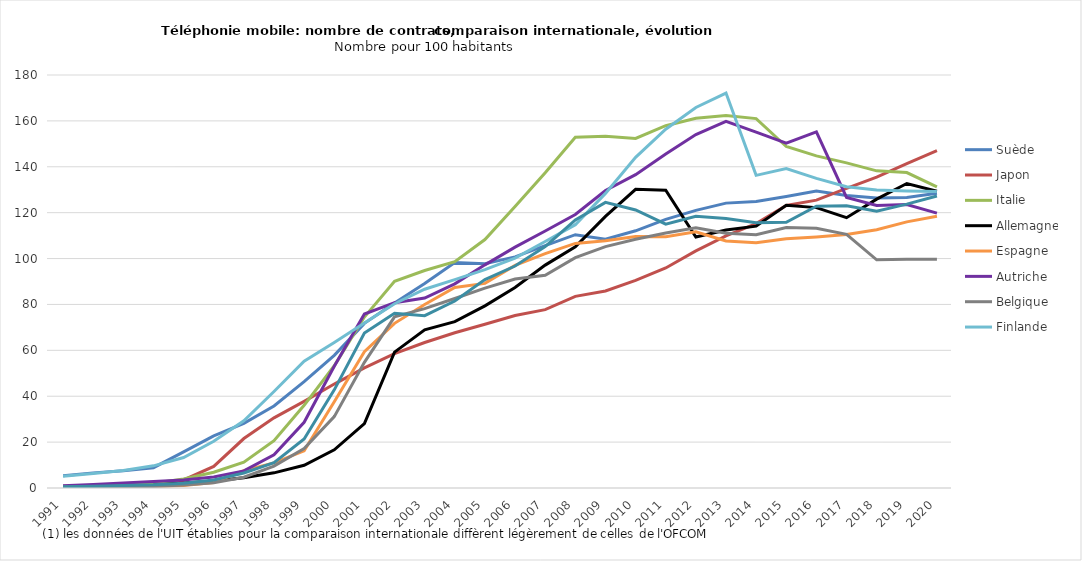
| Category | Suède | Japon | Italie | Allemagne | Espagne | Autriche | Belgique | Finlande | Pays-Bas |
|---|---|---|---|---|---|---|---|---|---|
| 1991 | 5.388 | 0.71 | 0.468 | 0 | 0.141 | 0.961 | 0.43 | 5.171 | 0.531 |
| 1992 | 6.594 | 1.123 | 0.999 | 0.339 | 0.278 | 1.494 | 0.514 | 6.371 | 0.767 |
| 1993 | 7.56 | 1.39 | 1.376 | 0.657 | 0.461 | 2.212 | 0.612 | 7.667 | 1.099 |
| 1994 | 8.864 | 1.724 | 2.12 | 1.191 | 0.656 | 2.805 | 0.672 | 9.665 | 1.42 |
| 1995 | 15.713 | 3.49 | 3.932 | 2.158 | 1.048 | 3.505 | 1.264 | 13.282 | 2.096 |
| 1996 | 22.749 | 9.409 | 6.886 | 3.01 | 2.397 | 4.803 | 2.315 | 20.342 | 3.495 |
| 1997 | 28.16 | 21.561 | 11.279 | 4.48 | 7.586 | 7.475 | 4.694 | 29.302 | 6.549 |
| 1998 | 35.771 | 30.591 | 20.634 | 6.61 | 10.953 | 14.471 | 9.548 | 42.067 | 11.004 |
| 1999 | 46.371 | 37.765 | 36.04 | 9.912 | 16.203 | 28.629 | 17.18 | 55.227 | 21.36 |
| 2000 | 57.832 | 45.302 | 53.27 | 16.662 | 37.561 | 53.078 | 31.112 | 63.38 | 42.767 |
| 2001 | 71.747 | 52.37 | 74.518 | 28.082 | 59.437 | 75.806 | 54.746 | 71.871 | 67.53 |
| 2002 | 80.672 | 58.583 | 90.103 | 59.216 | 71.772 | 80.776 | 74.59 | 80.292 | 76.164 |
| 2003 | 89.107 | 63.427 | 94.784 | 68.905 | 79.989 | 82.809 | 78.166 | 86.638 | 75.107 |
| 2004 | 98.319 | 67.668 | 98.62 | 72.518 | 87.378 | 88.969 | 82.597 | 90.818 | 81.477 |
| 2005 | 97.713 | 71.35 | 108.286 | 79.398 | 89.18 | 97.264 | 87.134 | 95.151 | 90.869 |
| 2006 | 100.723 | 75.187 | 122.681 | 87.355 | 96.99 | 104.984 | 91.067 | 100.211 | 96.743 |
| 2007 | 105.616 | 77.732 | 137.367 | 97.143 | 102.161 | 112.017 | 92.729 | 107.437 | 105.206 |
| 2008 | 110.411 | 83.536 | 152.858 | 105.13 | 106.589 | 119.224 | 100.379 | 114.766 | 116.832 |
| 2009 | 108.419 | 85.885 | 153.323 | 118.4 | 107.716 | 129.664 | 105.223 | 128.397 | 124.498 |
| 2010 | 112.1 | 90.463 | 152.325 | 130.17 | 109.594 | 136.563 | 108.428 | 144.134 | 121.187 |
| 2011 | 117.063 | 95.912 | 157.886 | 129.79 | 109.5 | 145.554 | 111.11 | 156.361 | 114.962 |
| 2012 | 120.995 | 103.317 | 161.172 | 109.369 | 111.695 | 154.05 | 113.457 | 165.862 | 118.467 |
| 2013 | 124.161 | 109.894 | 162.307 | 112.423 | 107.654 | 159.817 | 111.078 | 172.122 | 117.42 |
| 2014 | 124.915 | 115.254 | 160.991 | 114.113 | 106.879 | 155.116 | 110.411 | 136.261 | 115.576 |
| 2015 | 127.036 | 123.163 | 148.842 | 123.233 | 108.612 | 150.346 | 113.488 | 139.206 | 115.803 |
| 2016 | 129.431 | 125.452 | 144.756 | 122.197 | 109.419 | 155.215 | 113.166 | 134.94 | 122.851 |
| 2017 | 127.523 | 130.595 | 141.694 | 117.818 | 110.48 | 126.661 | 110.537 | 131.329 | 123.018 |
| 2018 | 126.395 | 135.519 | 138.234 | 125.885 | 112.561 | 123.119 | 99.453 | 129.913 | 120.625 |
| 2019 | 126.622 | 141.407 | 137.467 | 132.715 | 115.994 | 123.535 | 99.697 | 129.469 | 123.731 |
| 2020 | 128.491 | 147.023 | 131.265 | 129.324 | 118.44 | 119.775 | 99.742 | 129.244 | 127.285 |